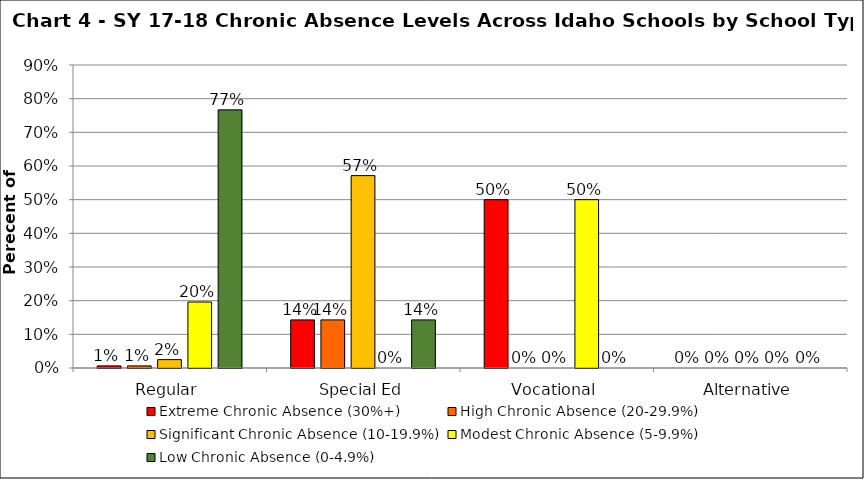
| Category | Extreme Chronic Absence (30%+) | High Chronic Absence (20-29.9%) | Significant Chronic Absence (10-19.9%) | Modest Chronic Absence (5-9.9%) | Low Chronic Absence (0-4.9%) |
|---|---|---|---|---|---|
| 0 | 0.006 | 0.006 | 0.025 | 0.196 | 0.767 |
| 1 | 0.143 | 0.143 | 0.571 | 0 | 0.143 |
| 2 | 0.5 | 0 | 0 | 0.5 | 0 |
| 3 | 0 | 0 | 0 | 0 | 0 |